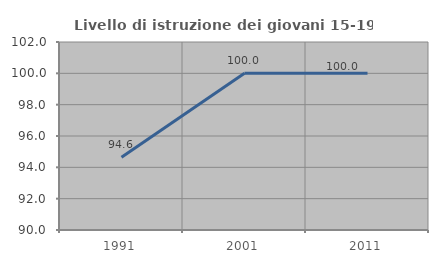
| Category | Livello di istruzione dei giovani 15-19 anni |
|---|---|
| 1991.0 | 94.643 |
| 2001.0 | 100 |
| 2011.0 | 100 |